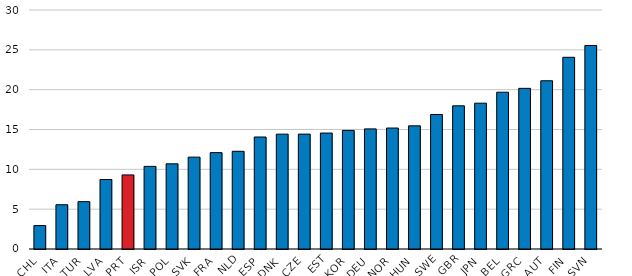
| Category | SMEs |
|---|---|
| CHL | 2.94 |
| ITA | 5.555 |
| TUR | 5.944 |
| LVA | 8.721 |
| PRT | 9.299 |
| ISR | 10.37 |
| POL | 10.689 |
| SVK | 11.532 |
| FRA | 12.097 |
| NLD | 12.265 |
| ESP | 14.057 |
| DNK | 14.417 |
| CZE | 14.421 |
| EST | 14.553 |
| KOR | 14.886 |
| DEU | 15.078 |
| NOR | 15.184 |
| HUN | 15.459 |
| SWE | 16.886 |
| GBR | 17.973 |
| JPN | 18.304 |
| BEL | 19.681 |
| GRC | 20.166 |
| AUT | 21.117 |
| FIN | 24.065 |
| SVN | 25.546 |